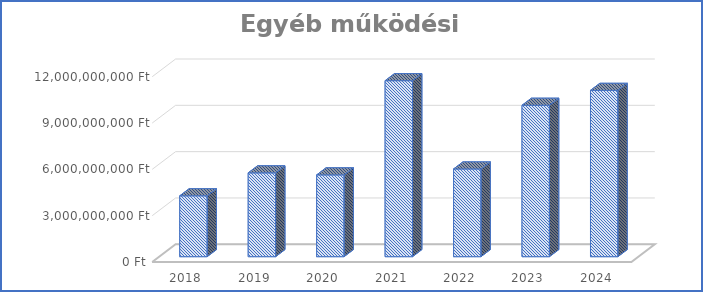
| Category | Egyéb működési kiadások |
|---|---|
| 2018.0 | 3942625601 |
| 2019.0 | 5428881702 |
| 2020.0 | 5297068193 |
| 2021.0 | 11399034498 |
| 2022.0 | 5681443890 |
| 2023.0 | 9806710864 |
| 2024.0 | 10772050981 |